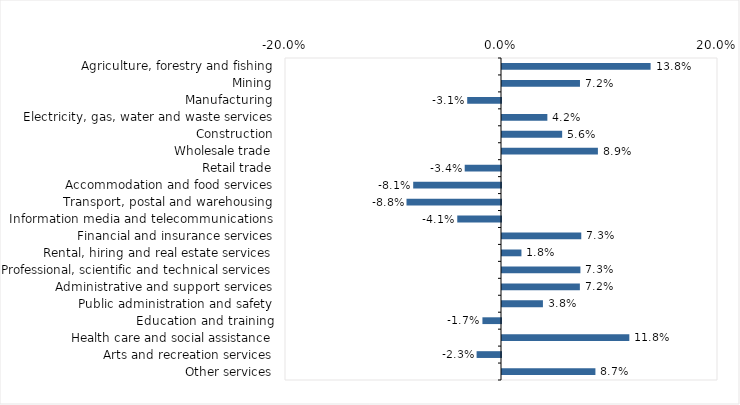
| Category | This week |
|---|---|
| Agriculture, forestry and fishing | 0.138 |
| Mining | 0.072 |
| Manufacturing | -0.031 |
| Electricity, gas, water and waste services | 0.042 |
| Construction | 0.056 |
| Wholesale trade | 0.089 |
| Retail trade | -0.034 |
| Accommodation and food services | -0.081 |
| Transport, postal and warehousing | -0.088 |
| Information media and telecommunications | -0.04 |
| Financial and insurance services | 0.073 |
| Rental, hiring and real estate services | 0.018 |
| Professional, scientific and technical services | 0.073 |
| Administrative and support services | 0.072 |
| Public administration and safety | 0.038 |
| Education and training | -0.017 |
| Health care and social assistance | 0.118 |
| Arts and recreation services | -0.023 |
| Other services | 0.086 |